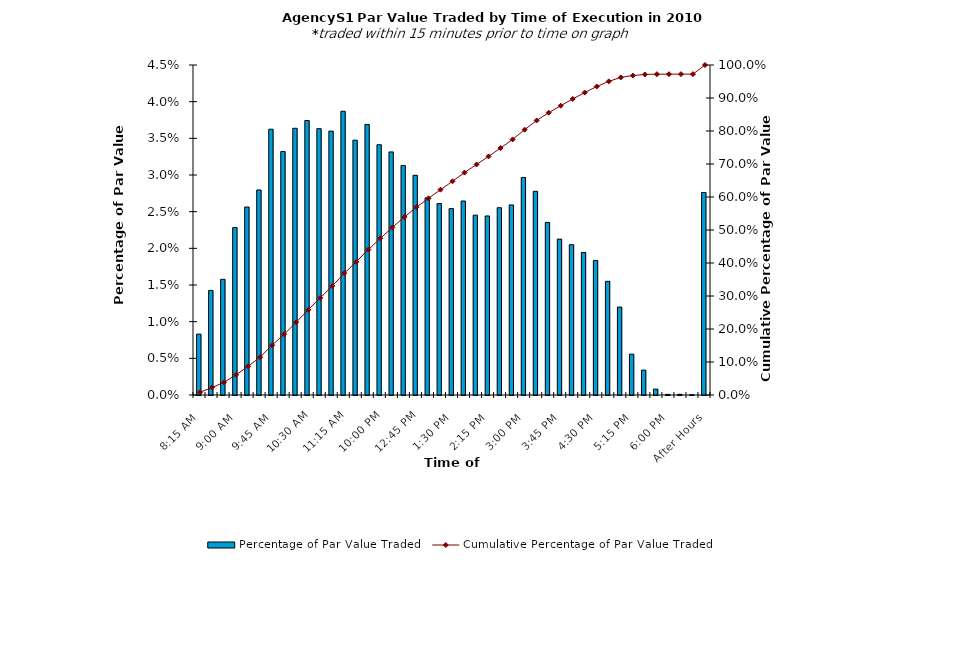
| Category | Percentage of Par Value Traded |
|---|---|
| 8:15 AM | 0.008 |
| 8:30 AM | 0.014 |
| 8:45 AM | 0.016 |
| 9:00 AM | 0.023 |
| 9:15 AM | 0.026 |
| 9:30 AM | 0.028 |
| 9:45 AM | 0.036 |
| 10:00 AM | 0.033 |
| 10:15 AM | 0.036 |
| 10:30 AM | 0.037 |
| 10:45 AM | 0.036 |
| 11:00 AM | 0.036 |
| 11:15 AM | 0.039 |
| 11:30 AM | 0.035 |
| 11:45 AM | 0.037 |
| 12:00 PM | 0.034 |
| 12:15 PM | 0.033 |
| 12:30 PM | 0.031 |
| 12:45 PM | 0.03 |
| 1:00 PM | 0.027 |
| 1:15 PM | 0.026 |
| 1:30 PM | 0.025 |
| 1:45 PM | 0.026 |
| 2:00 PM | 0.025 |
| 2:15 PM | 0.024 |
| 2:30 PM | 0.026 |
| 2:45 PM | 0.026 |
| 3:00 PM | 0.03 |
| 3:15 PM | 0.028 |
| 3:30 PM | 0.024 |
| 3:45 PM | 0.021 |
| 4:00 PM | 0.02 |
| 4:15 PM | 0.019 |
| 4:30 PM | 0.018 |
| 4:45 PM | 0.016 |
| 5:00 PM | 0.012 |
| 5:15 PM | 0.006 |
| 5:30 PM | 0.003 |
| 5:45 PM | 0.001 |
| 6:00 PM | 0 |
| 6:15 PM | 0 |
| 6:30 PM | 0 |
| After Hours | 0.028 |